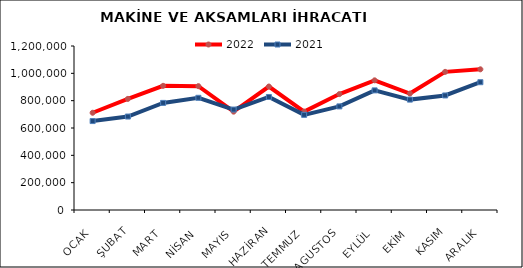
| Category | 2022 | 2021 |
|---|---|---|
| OCAK | 711562.558 | 650750.301 |
| ŞUBAT | 813024.71 | 683825.224 |
| MART | 908594.497 | 783681.31 |
| NİSAN | 906174.478 | 820942.232 |
| MAYIS | 719599.71 | 734997.23 |
| HAZİRAN | 903466.974 | 826943.156 |
| TEMMUZ | 720254.892 | 696211.515 |
| AGUSTOS | 848184.234 | 758018.247 |
| EYLÜL | 948771.182 | 875217.292 |
| EKİM | 851995.111 | 807782.307 |
| KASIM | 1010718.163 | 838109.242 |
| ARALIK | 1029367.576 | 935026.863 |